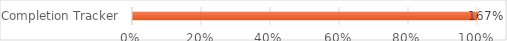
| Category | Series 0 |
|---|---|
| Completion Tracker | 1.667 |